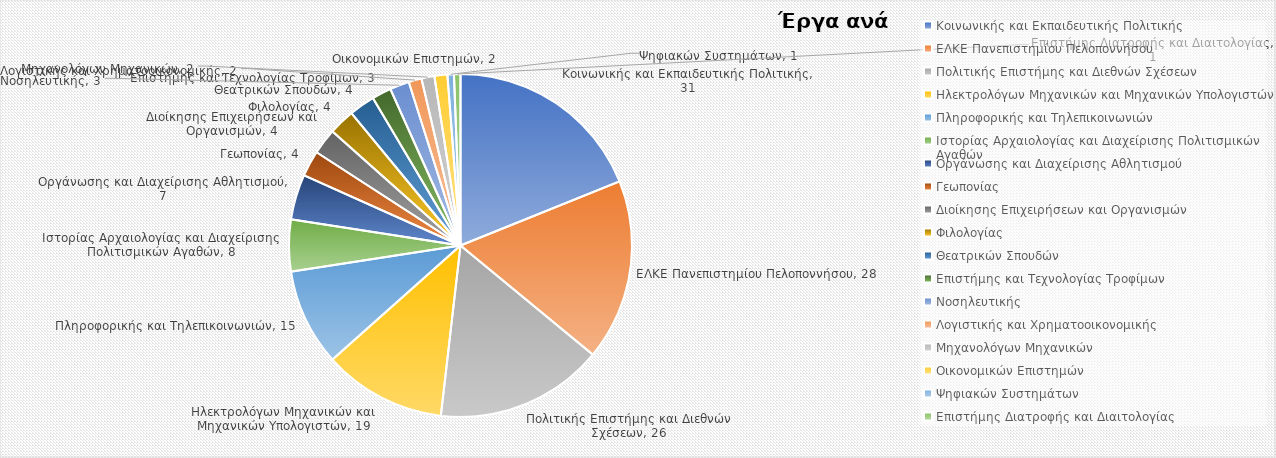
| Category | Series 0 |
|---|---|
| Κοινωνικής και Εκπαιδευτικής Πολιτικής | 31 |
| ΕΛΚΕ Πανεπιστημίου Πελοποννήσου | 28 |
| Πολιτικής Επιστήμης και Διεθνών Σχέσεων | 26 |
| Ηλεκτρολόγων Μηχανικών και Μηχανικών Υπολογιστών | 19 |
| Πληροφορικής και Τηλεπικοινωνιών | 15 |
| Ιστορίας Αρχαιολογίας και Διαχείρισης Πολιτισμικών Αγαθών | 8 |
| Οργάνωσης και Διαχείρισης Αθλητισμού | 7 |
| Γεωπονίας | 4 |
| Διοίκησης Επιχειρήσεων και Οργανισμών | 4 |
| Φιλολογίας | 4 |
| Θεατρικών Σπουδών | 4 |
| Επιστήμης και Τεχνολογίας Τροφίμων | 3 |
| Νοσηλευτικής | 3 |
| Λογιστικής και Χρηματοοικονομικής | 2 |
| Μηχανολόγων Μηχανικών | 2 |
| Οικονομικών Επιστημών | 2 |
| Ψηφιακών Συστημάτων | 1 |
| Επιστήμης Διατροφής και Διαιτολογίας | 1 |